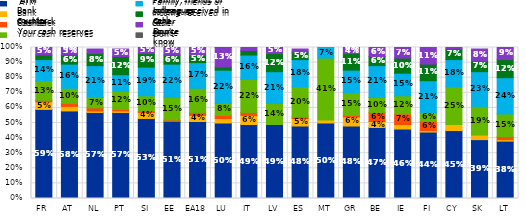
| Category | ATM | Bank counter | Cashback | Your cash reserves | Family, friends or colleagues | Income received in cash | Other source | Don't know |
|---|---|---|---|---|---|---|---|---|
| FR | 0.59 | 0.05 | 0.01 | 0.13 | 0.14 | 0.03 | 0.05 | 0 |
| AT | 0.58 | 0.03 | 0.02 | 0.1 | 0.16 | 0.06 | 0.05 | 0 |
| NL | 0.57 | 0.01 | 0.02 | 0.07 | 0.21 | 0.08 | 0.03 | 0 |
| PT | 0.57 | 0.01 | 0.01 | 0.12 | 0.11 | 0.12 | 0.05 | 0 |
| SI | 0.53 | 0.04 | 0.01 | 0.1 | 0.19 | 0.09 | 0.05 | 0 |
| EE | 0.51 | 0 | 0.01 | 0.15 | 0.22 | 0.06 | 0.05 | 0 |
| EA18 | 0.51 | 0.04 | 0.02 | 0.16 | 0.17 | 0.05 | 0.05 | 0 |
| LU | 0.5 | 0.03 | 0.02 | 0.08 | 0.22 | 0.02 | 0.13 | 0.01 |
| IT | 0.49 | 0.06 | 0.02 | 0.22 | 0.16 | 0.03 | 0.02 | 0 |
| LV | 0.49 | 0 | 0 | 0.14 | 0.21 | 0.12 | 0.05 | 0 |
| ES | 0.48 | 0.05 | 0.01 | 0.2 | 0.18 | 0.05 | 0.02 | 0 |
| MT | 0.5 | 0.02 | 0 | 0.41 | 0.07 | 0 | 0 | 0 |
| GR | 0.48 | 0.06 | 0.01 | 0.15 | 0.15 | 0.11 | 0.04 | 0 |
| BE | 0.47 | 0.04 | 0.06 | 0.1 | 0.21 | 0.06 | 0.06 | 0 |
| IE | 0.46 | 0.03 | 0.07 | 0.12 | 0.15 | 0.1 | 0.07 | 0 |
| FI | 0.44 | 0.01 | 0.06 | 0.06 | 0.21 | 0.11 | 0.11 | 0 |
| CY | 0.45 | 0.04 | 0 | 0.25 | 0.18 | 0.07 | 0.01 | 0 |
| SK | 0.39 | 0.03 | 0 | 0.19 | 0.23 | 0.07 | 0.08 | 0 |
| LT | 0.38 | 0.01 | 0.02 | 0.15 | 0.24 | 0.12 | 0.09 | 0 |